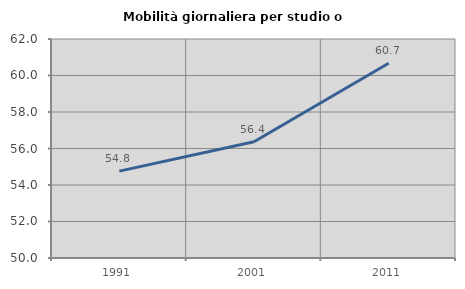
| Category | Mobilità giornaliera per studio o lavoro |
|---|---|
| 1991.0 | 54.759 |
| 2001.0 | 56.371 |
| 2011.0 | 60.676 |